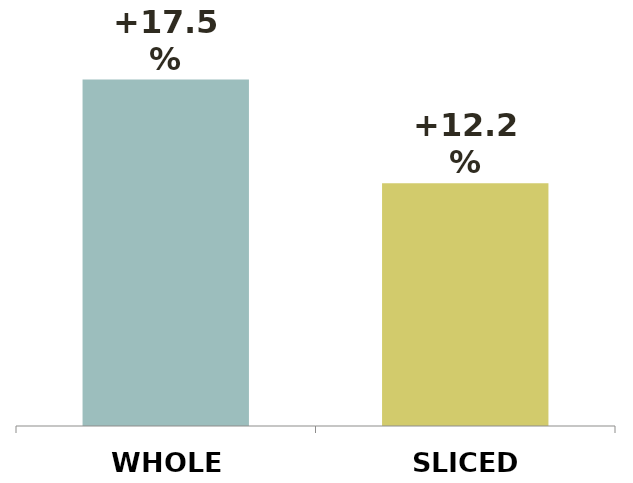
| Category | Series 0 |
|---|---|
| WHOLE | 0.175 |
| SLICED | 0.122 |